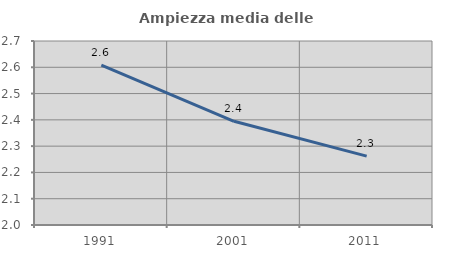
| Category | Ampiezza media delle famiglie |
|---|---|
| 1991.0 | 2.608 |
| 2001.0 | 2.394 |
| 2011.0 | 2.262 |